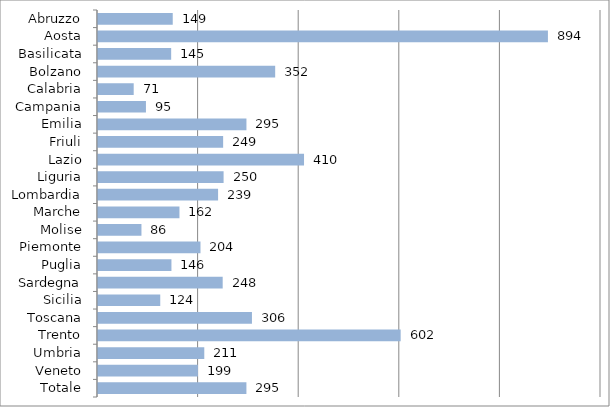
| Category | Series 0 |
|---|---|
| Abruzzo | 148.586 |
| Aosta | 894.48 |
| Basilicata | 145.468 |
| Bolzano | 352.241 |
| Calabria | 70.978 |
| Campania | 95.325 |
| Emilia | 295.112 |
| Friuli | 248.795 |
| Lazio | 409.596 |
| Liguria | 249.687 |
| Lombardia | 238.739 |
| Marche | 161.946 |
| Molise | 86.382 |
| Piemonte | 203.746 |
| Puglia | 146.001 |
| Sardegna | 247.894 |
| Sicilia | 123.742 |
| Toscana | 306.065 |
| Trento | 601.703 |
| Umbria | 211.289 |
| Veneto | 198.651 |
| Totale | 295.06 |